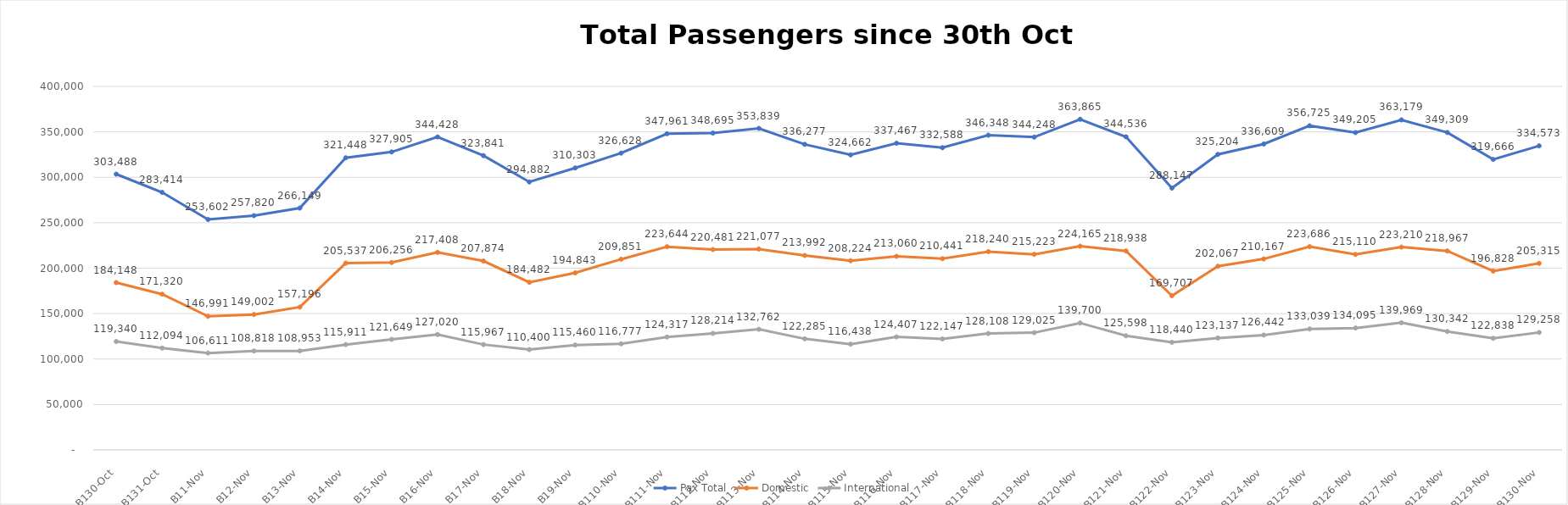
| Category | Pax Total |  Domestic  |  International  |
|---|---|---|---|
| 2022-10-30 | 303488 | 184148 | 119340 |
| 2022-10-31 | 283414 | 171320 | 112094 |
| 2022-11-01 | 253602 | 146991 | 106611 |
| 2022-11-02 | 257820 | 149002 | 108818 |
| 2022-11-03 | 266149 | 157196 | 108953 |
| 2022-11-04 | 321448 | 205537 | 115911 |
| 2022-11-05 | 327905 | 206256 | 121649 |
| 2022-11-06 | 344428 | 217408 | 127020 |
| 2022-11-07 | 323841 | 207874 | 115967 |
| 2022-11-08 | 294882 | 184482 | 110400 |
| 2022-11-09 | 310303 | 194843 | 115460 |
| 2022-11-10 | 326628 | 209851 | 116777 |
| 2022-11-11 | 347961 | 223644 | 124317 |
| 2022-11-12 | 348695 | 220481 | 128214 |
| 2022-11-13 | 353839 | 221077 | 132762 |
| 2022-11-14 | 336277 | 213992 | 122285 |
| 2022-11-15 | 324662 | 208224 | 116438 |
| 2022-11-16 | 337467 | 213060 | 124407 |
| 2022-11-17 | 332588 | 210441 | 122147 |
| 2022-11-18 | 346348 | 218240 | 128108 |
| 2022-11-19 | 344248 | 215223 | 129025 |
| 2022-11-20 | 363865 | 224165 | 139700 |
| 2022-11-21 | 344536 | 218938 | 125598 |
| 2022-11-22 | 288147 | 169707 | 118440 |
| 2022-11-23 | 325204 | 202067 | 123137 |
| 2022-11-24 | 336609 | 210167 | 126442 |
| 2022-11-25 | 356725 | 223686 | 133039 |
| 2022-11-26 | 349205 | 215110 | 134095 |
| 2022-11-27 | 363179 | 223210 | 139969 |
| 2022-11-28 | 349309 | 218967 | 130342 |
| 2022-11-29 | 319666 | 196828 | 122838 |
| 2022-11-30 | 334573 | 205315 | 129258 |